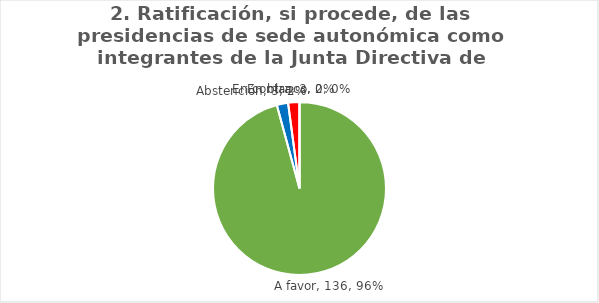
| Category | Series 0 |
|---|---|
| A favor | 136 |
| Abstención | 3 |
| En contra | 3 |
| En blanco | 0 |